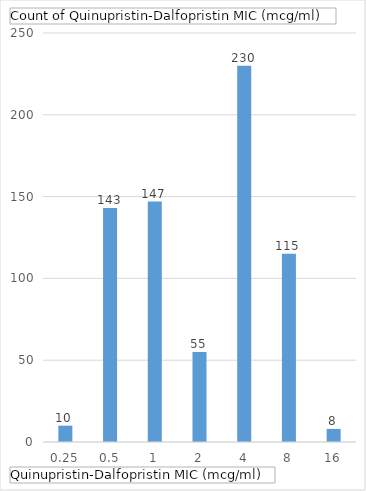
| Category | Total |
|---|---|
| 0.25 | 10 |
| 0.5 | 143 |
| 1 | 147 |
| 2 | 55 |
| 4 | 230 |
| 8 | 115 |
| 16 | 8 |